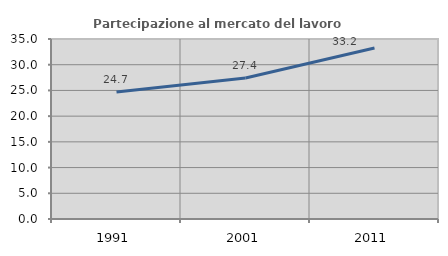
| Category | Partecipazione al mercato del lavoro  femminile |
|---|---|
| 1991.0 | 24.694 |
| 2001.0 | 27.411 |
| 2011.0 | 33.247 |